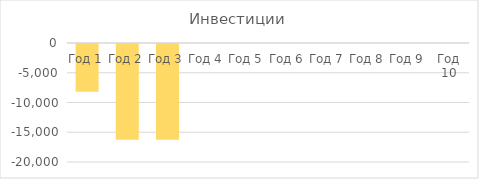
| Category | Инвестиции |
|---|---|
| Год 1 | -8040 |
| Год 2 | -16080 |
| Год 3 | -16080 |
| Год 4 | 0 |
| Год 5 | 0 |
| Год 6 | 0 |
| Год 7 | 0 |
| Год 8 | 0 |
| Год 9 | 0 |
| Год 10 | 0 |